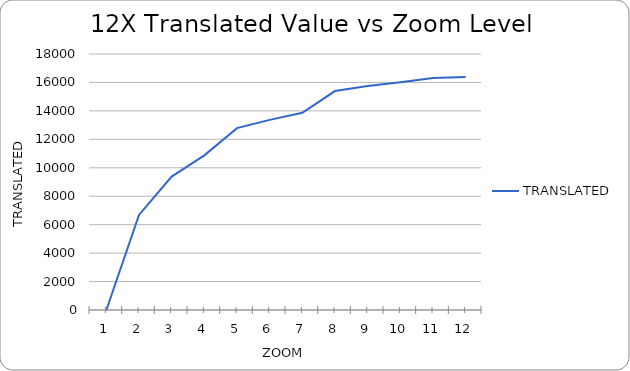
| Category | TRANSLATED |
|---|---|
| 1.0 | 0 |
| 2.0 | 6682.636 |
| 3.0 | 9379.514 |
| 4.0 | 10873.341 |
| 5.0 | 12786.682 |
| 6.0 | 13366.751 |
| 7.0 | 13862.474 |
| 8.0 | 15394.035 |
| 9.0 | 15747.699 |
| 10.0 | 16006.659 |
| 11.0 | 16305.572 |
| 12.0 | 16384 |